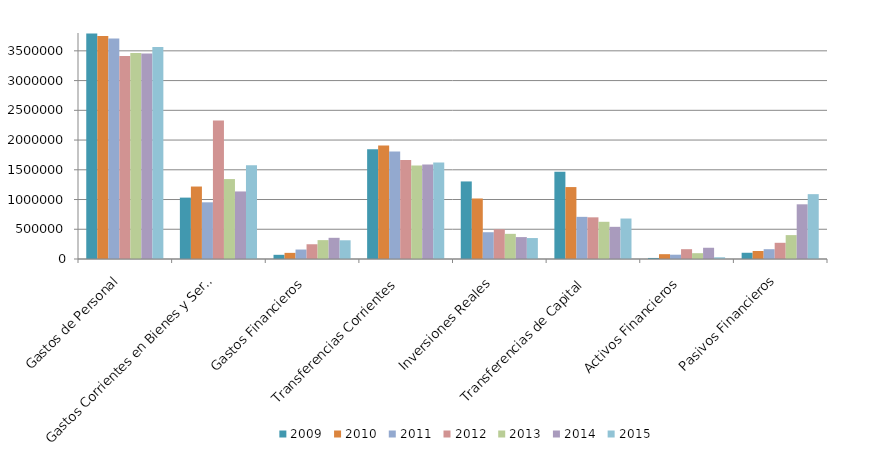
| Category | 2009 | 2010 | 2011 | 2012 | 2013 | 2014 | 2015 |
|---|---|---|---|---|---|---|---|
| Gastos de Personal  | 3792100.46 | 3750642.91 | 3706896.22 | 3413262.38 | 3464202.85 | 3455477 | 3565132.74 |
| Gastos Corrientes en Bienes y Servicios  | 1032085.55 | 1218484.74 | 953153.48 | 2327244.43 | 1343966.96 | 1135720.38 | 1575464.87 |
| Gastos Financieros  | 70551.34 | 103190.25 | 159112.97 | 248050.42 | 317406.88 | 356247.77 | 314691.12 |
| Transferencias Corrientes  | 1846213.81 | 1908287.38 | 1806639.66 | 1665963.29 | 1572934.01 | 1588393.57 | 1621919 |
| Inversiones Reales  | 1304062.93 | 1017421.75 | 450296.61 | 499528.28 | 422797.54 | 368223.22 | 352322.69 |
| Transferencias de Capital  | 1467298.41 | 1209425.19 | 708656.01 | 700611.81 | 625614 | 541004.21 | 680484.12 |
| Activos Financieros  | 17492.66 | 81155.34 | 72142.83 | 164990.11 | 97883.81 | 189002.63 | 28977.78 |
| Pasivos Financieros  | 104866 | 134864.62 | 164735.11 | 272389.04 | 401825.44 | 919591.55 | 1090374.89 |